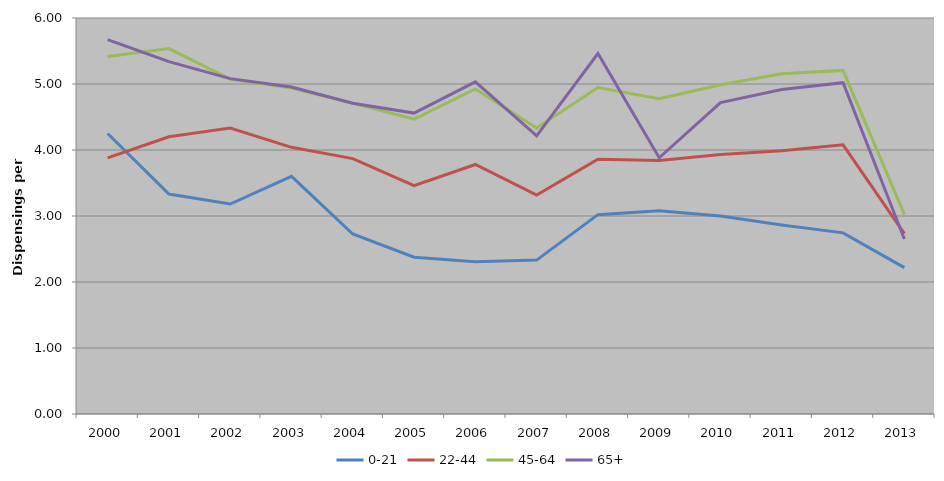
| Category | 0-21 | 22-44 | 45-64 | 65+ |
|---|---|---|---|---|
| 2000 | 4.25 | 3.879 | 5.415 | 5.672 |
| 2001 | 3.333 | 4.2 | 5.537 | 5.339 |
| 2002 | 3.182 | 4.333 | 5.073 | 5.081 |
| 2003 | 3.6 | 4.041 | 4.939 | 4.954 |
| 2004 | 2.727 | 3.87 | 4.706 | 4.708 |
| 2005 | 2.375 | 3.46 | 4.469 | 4.56 |
| 2006 | 2.307 | 3.78 | 4.926 | 5.033 |
| 2007 | 2.332 | 3.319 | 4.333 | 4.214 |
| 2008 | 3.021 | 3.861 | 4.947 | 5.462 |
| 2009 | 3.081 | 3.84 | 4.779 | 3.882 |
| 2010 | 3 | 3.932 | 4.987 | 4.718 |
| 2011 | 2.864 | 3.99 | 5.155 | 4.917 |
| 2012 | 2.745 | 4.078 | 5.206 | 5.02 |
| 2013 | 2.218 | 2.732 | 3.024 | 2.652 |